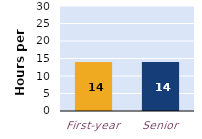
| Category | hours per week |
|---|---|
| First-year | 14 |
| Senior | 14 |